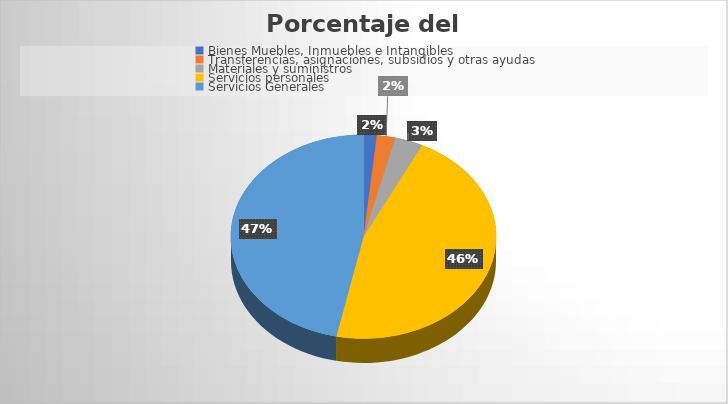
| Category | Porcentaje  |
|---|---|
| Bienes Muebles, Inmuebles e Intangibles | 1.596 |
| Transferencias, asignaciones, subsidios y otras ayudas | 2.242 |
| Materiales y suministros  | 3.431 |
| Servicios personales | 46.007 |
| Servicios Generales | 46.723 |